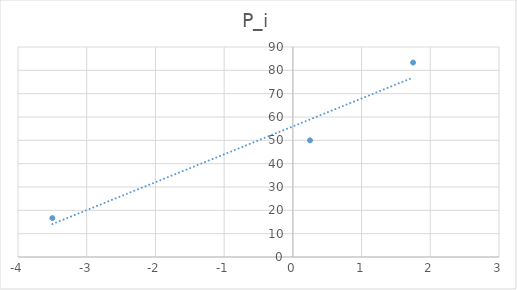
| Category | P_i |
|---|---|
| -3.5 | 16.667 |
| 0.25 | 50 |
| 1.75 | 83.333 |